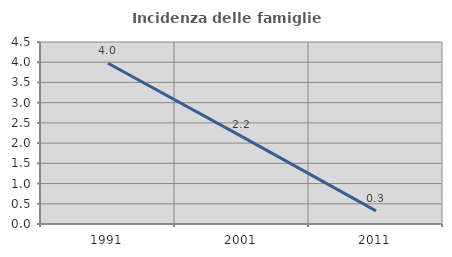
| Category | Incidenza delle famiglie numerose |
|---|---|
| 1991.0 | 3.976 |
| 2001.0 | 2.16 |
| 2011.0 | 0.326 |